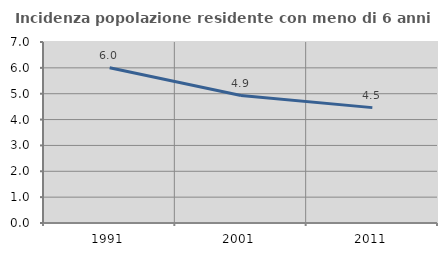
| Category | Incidenza popolazione residente con meno di 6 anni |
|---|---|
| 1991.0 | 6.005 |
| 2001.0 | 4.929 |
| 2011.0 | 4.462 |